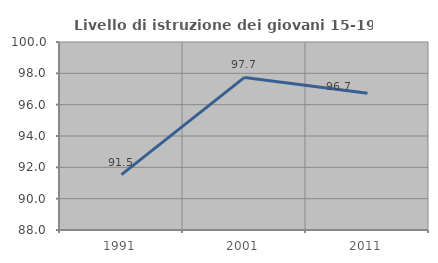
| Category | Livello di istruzione dei giovani 15-19 anni |
|---|---|
| 1991.0 | 91.537 |
| 2001.0 | 97.738 |
| 2011.0 | 96.73 |